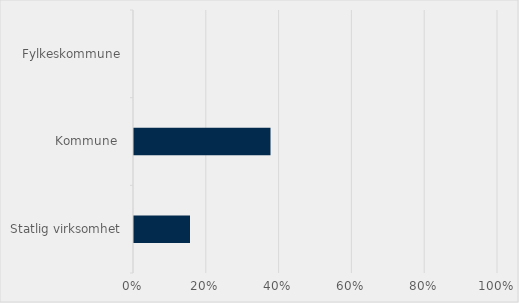
| Category | Series 0 |
|---|---|
| Statlig virksomhet | 0.154 |
| Kommune  | 0.375 |
| Fylkeskommune | 0 |